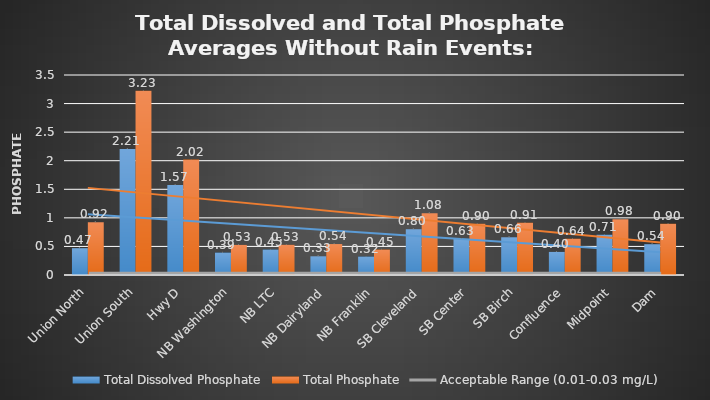
| Category | Total Dissolved Phosphate | Total Phosphate |
|---|---|---|
| Union North | 0.469 | 0.922 |
| Union South | 2.205 | 3.225 |
| Hwy D | 1.574 | 2.021 |
| NB Washington | 0.393 | 0.527 |
| NB LTC | 0.446 | 0.528 |
| NB Dairyland | 0.327 | 0.542 |
| NB Franklin | 0.323 | 0.446 |
| SB Cleveland | 0.801 | 1.079 |
| SB Center | 0.634 | 0.897 |
| SB Birch | 0.66 | 0.915 |
| Confluence | 0.404 | 0.635 |
| Midpoint | 0.706 | 0.977 |
| Dam | 0.539 | 0.897 |